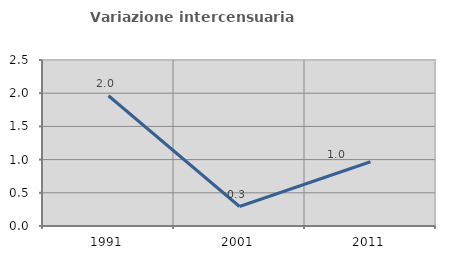
| Category | Variazione intercensuaria annua |
|---|---|
| 1991.0 | 1.962 |
| 2001.0 | 0.293 |
| 2011.0 | 0.968 |